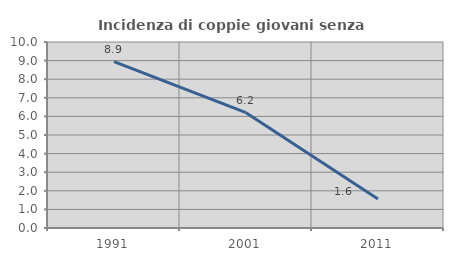
| Category | Incidenza di coppie giovani senza figli |
|---|---|
| 1991.0 | 8.943 |
| 2001.0 | 6.202 |
| 2011.0 | 1.562 |